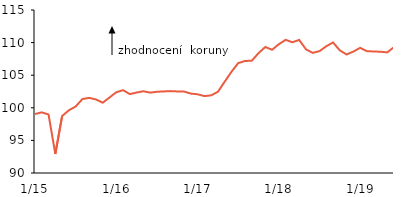
| Category | NEER |
|---|---|
|  1/15 | 99.045 |
| 2 | 99.302 |
| 3 | 98.972 |
| 4 | 92.914 |
| 5 | 98.732 |
| 6 | 99.621 |
| 7 | 100.197 |
| 8 | 101.341 |
| 9 | 101.526 |
| 10 | 101.281 |
| 11 | 100.782 |
| 12 | 101.58 |
|  1/16 | 102.385 |
| 2 | 102.704 |
| 3 | 102.101 |
| 4 | 102.341 |
| 5 | 102.539 |
| 6 | 102.329 |
| 7 | 102.459 |
| 8 | 102.511 |
| 9 | 102.56 |
| 10 | 102.512 |
| 11 | 102.492 |
| 12 | 102.18 |
|  1/17 | 102.076 |
| 2 | 101.791 |
| 3 | 101.911 |
| 4 | 102.453 |
| 5 | 103.999 |
| 6 | 105.517 |
| 7 | 106.854 |
| 8 | 107.182 |
| 9 | 107.216 |
| 10 | 108.386 |
| 11 | 109.33 |
| 12 | 108.9 |
|  1/18 | 109.753 |
| 2 | 110.424 |
| 3 | 110.052 |
| 4 | 110.413 |
| 5 | 108.968 |
| 6 | 108.426 |
| 7 | 108.684 |
| 8 | 109.438 |
| 9 | 110.02 |
| 10 | 108.812 |
| 11 | 108.171 |
| 12 | 108.626 |
|  1/19 | 109.192 |
| 2 | 108.691 |
| 3 | 108.637 |
| 4 | 108.599 |
| 5 | 108.5 |
| 6 | 109.308 |